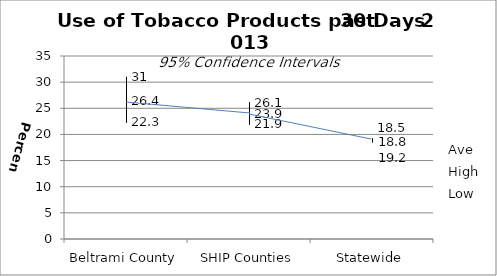
| Category | Ave | High | Low |
|---|---|---|---|
| Beltrami County | 26.4 | 31 | 22.3 |
| SHIP Counties | 23.9 | 26.1 | 21.9 |
| Statewide | 18.8 | 18.5 | 19.2 |